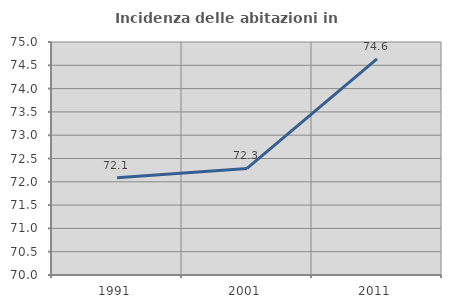
| Category | Incidenza delle abitazioni in proprietà  |
|---|---|
| 1991.0 | 72.085 |
| 2001.0 | 72.286 |
| 2011.0 | 74.638 |